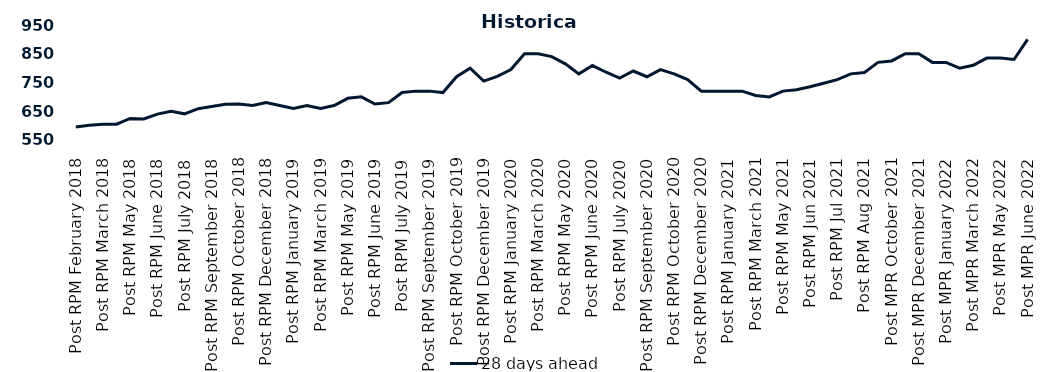
| Category | 28 days ahead |
|---|---|
| Post RPM February 2018 | 595 |
| Pre RPM March 2018 | 601 |
| Post RPM March 2018 | 605 |
| Pre RPM May 2018 | 605 |
| Post RPM May 2018 | 625 |
| Pre RPM June 2018 | 623 |
| Post RPM June 2018 | 640 |
| Pre RPM July 2018 | 650 |
| Post RPM July 2018 | 641 |
| Pre RPM September 2018 | 659 |
| Post RPM September 2018 | 666.75 |
| Pre RPM October 2018 | 674 |
| Post RPM October 2018 | 675 |
| Pre RPM December 2018 | 670 |
| Post RPM December 2018 | 680 |
| Pre RPM January 2019 | 670 |
| Post RPM January 2019 | 660 |
| Pre RPM March 2019 | 670 |
| Post RPM March 2019 | 660 |
| Pre RPM May 2019 | 670 |
| Post RPM May 2019 | 695 |
| Pre RPM June 2019 | 700 |
| Post RPM June 2019 | 675 |
| Pre RPM July 2019 | 680 |
| Post RPM July 2019 | 715 |
| Pre RPM September 2019 | 720 |
| Post RPM September 2019 | 720 |
| Pre RPM October 2019 | 715 |
| Post RPM October 2019 | 770 |
| Pre RPM December 2019 | 800 |
| Post RPM December 2019 | 755 |
| Pre RPM January 2020 | 771 |
| Post RPM January 2020 | 795 |
| Pre RPM March 2020 | 850 |
| Post RPM March 2020 | 850 |
| Pre RPM May 2020 | 840 |
| Post RPM May 2020 | 815 |
| Pre RPM June 2020 | 780 |
| Post RPM June 2020 | 809 |
| Pre RPM July 2020 | 785.72 |
| Post RPM July 2020 | 765 |
| Pre RPM September 2020 | 790 |
| Post RPM September 2020 | 770 |
| Pre RPM October 2020 | 795 |
| Post RPM October 2020 | 780 |
| Pre RPM December 2020 | 760 |
|  Post RPM December 2020 | 720 |
| Pre RPM January 2021 | 720 |
| Post RPM January 2021 | 720 |
|  Pre RPM March 2021 | 720 |
|  Post RPM March 2021 | 705 |
|  Pre RPM May 2021 | 700 |
|  Post RPM May 2021 | 720 |
|  Pre RPM Jun 2021 | 725 |
|   Post RPM Jun 2021 | 735 |
| Pre RPM Jul 2021 | 747.5 |
|  Post RPM Jul 2021 | 760 |
| Pre RPM Aug 2021 | 780 |
|  Post RPM Aug 2021 | 785 |
| Pre MPR October 2021 | 820 |
| Post MPR October 2021 | 825 |
| Pre MPR December 2021 | 850 |
| Post MPR December 2021 | 850 |
| Pre MPR January 2022 | 820 |
| Post MPR January 2022 | 820 |
| Pre MPR March 2022 | 800 |
| Post MPR March 2022 | 810 |
| Pre MPR May 2022 | 835 |
| Post MPR May 2022 | 835 |
| Pre MPR June 2022 | 830 |
| Post MPR June 2022 | 900 |